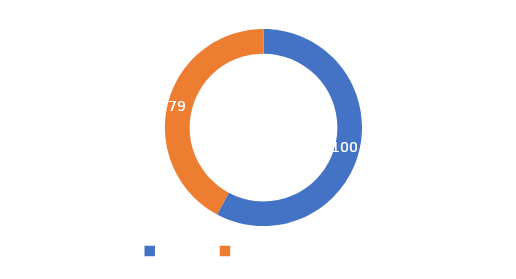
| Category | Series 0 |
|---|---|
| META  | 100 |
| CUMPLIMIENTO | 73 |